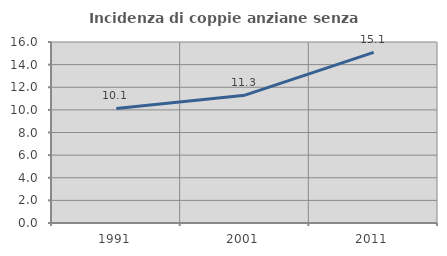
| Category | Incidenza di coppie anziane senza figli  |
|---|---|
| 1991.0 | 10.127 |
| 2001.0 | 11.298 |
| 2011.0 | 15.084 |